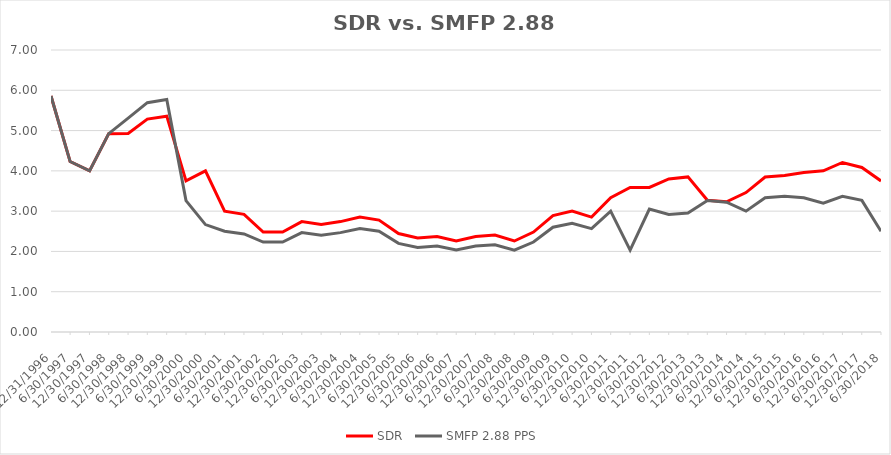
| Category | SDR | SMFP 2.88 PPS |
|---|---|---|
| 12/31/96 | 5.857 | 5.857 |
| 6/30/97 | 4.231 | 4.231 |
| 12/31/97 | 4 | 4 |
| 6/30/98 | 4.923 | 4.923 |
| 12/31/98 | 4.929 | 5.308 |
| 6/30/99 | 5.286 | 5.692 |
| 12/31/99 | 5.357 | 5.769 |
| 6/30/00 | 3.75 | 3.261 |
| 12/31/00 | 4 | 2.667 |
| 6/30/01 | 3 | 2.5 |
| 12/31/01 | 2.92 | 2.433 |
| 6/30/02 | 2.481 | 2.233 |
| 12/31/02 | 2.481 | 2.233 |
| 6/30/03 | 2.741 | 2.467 |
| 12/31/03 | 2.667 | 2.4 |
| 6/30/04 | 2.741 | 2.467 |
| 12/31/04 | 2.852 | 2.567 |
| 6/30/05 | 2.778 | 2.5 |
| 12/31/05 | 2.444 | 2.2 |
| 6/30/06 | 2.333 | 2.1 |
| 12/31/06 | 2.37 | 2.133 |
| 6/30/07 | 2.259 | 2.033 |
| 12/31/07 | 2.37 | 2.133 |
| 6/30/08 | 2.407 | 2.167 |
| 12/31/08 | 2.259 | 2.033 |
| 6/30/09 | 2.481 | 2.233 |
| 12/31/09 | 2.889 | 2.6 |
| 6/30/10 | 3 | 2.7 |
| 12/31/10 | 2.852 | 2.567 |
| 6/30/11 | 3.333 | 3 |
| 12/31/11 | 3.588 | 2.033 |
| 6/30/12 | 3.588 | 3.05 |
| 12/31/12 | 3.8 | 2.917 |
| 6/30/13 | 3.85 | 2.955 |
| 12/31/13 | 3.269 | 3.262 |
| 6/30/14 | 3.231 | 3.224 |
| 12/31/14 | 3.462 | 3 |
| 6/30/15 | 3.846 | 3.333 |
| 12/31/15 | 3.885 | 3.367 |
| 6/30/16 | 3.958 | 3.33 |
| 12/31/16 | 4 | 3.2 |
| 6/30/17 | 4.208 | 3.367 |
| 12/31/17 | 4.083 | 3.267 |
| 6/30/18 | 3.75 | 2.5 |